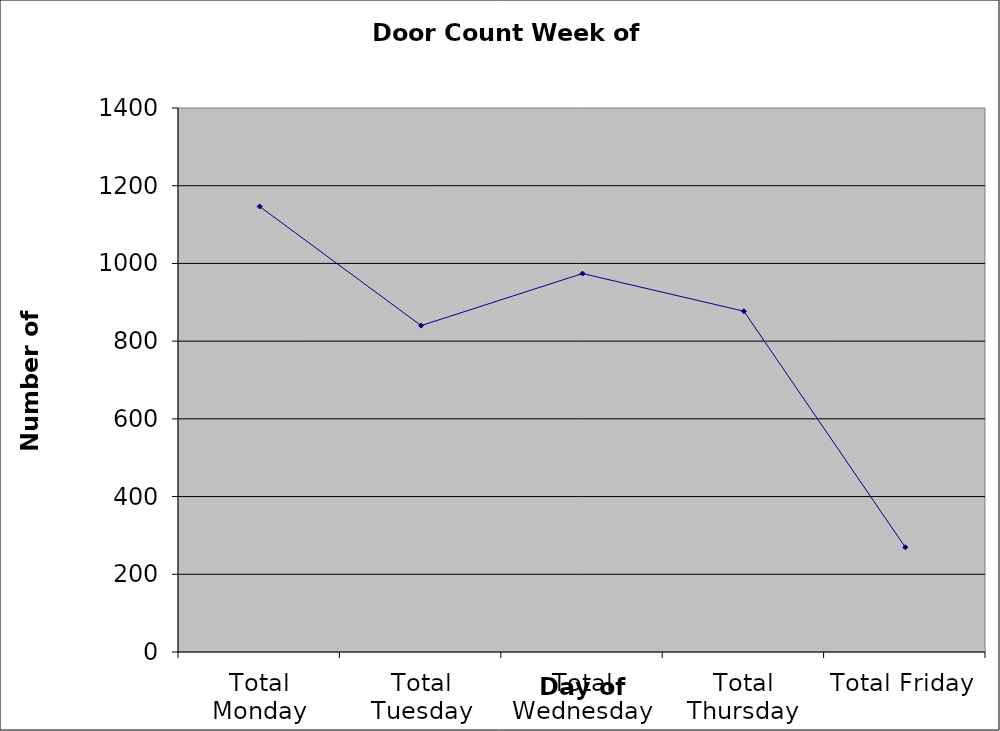
| Category | Series 0 |
|---|---|
| Total Monday | 1146.5 |
| Total Tuesday | 840 |
| Total Wednesday | 974 |
| Total Thursday | 877 |
| Total Friday | 269.5 |